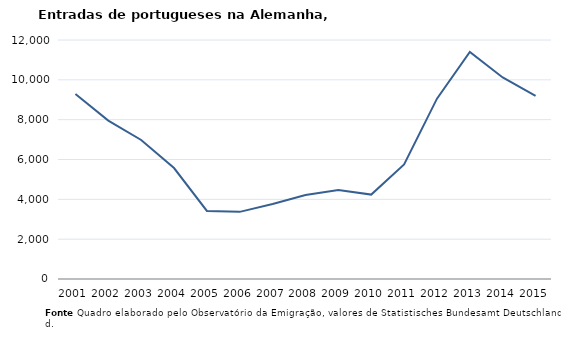
| Category | Entradas |
|---|---|
| 2001.0 | 9287 |
| 2002.0 | 7955 |
| 2003.0 | 6981 |
| 2004.0 | 5570 |
| 2005.0 | 3418 |
| 2006.0 | 3371 |
| 2007.0 | 3766 |
| 2008.0 | 4214 |
| 2009.0 | 4468 |
| 2010.0 | 4238 |
| 2011.0 | 5752 |
| 2012.0 | 9054 |
| 2013.0 | 11401 |
| 2014.0 | 10121 |
| 2015.0 | 9195 |